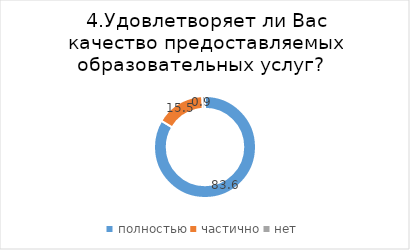
| Category | Series 0 |
|---|---|
| полностью | 83.621 |
| частично | 15.517 |
| нет | 0.862 |